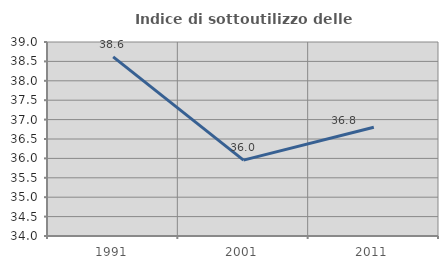
| Category | Indice di sottoutilizzo delle abitazioni  |
|---|---|
| 1991.0 | 38.616 |
| 2001.0 | 35.956 |
| 2011.0 | 36.804 |